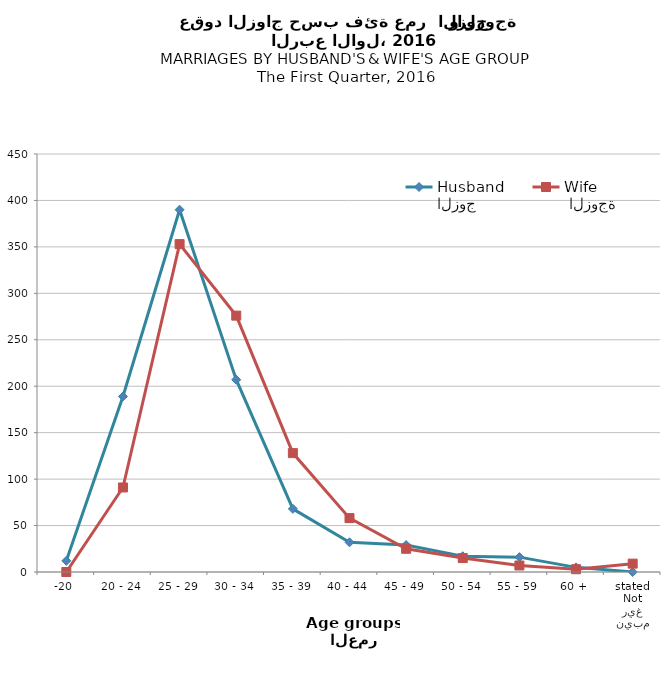
| Category | الزوج
Husband |  الزوجة
Wife |
|---|---|---|
| -20 | 12 | 0 |
| 20 - 24 | 189 | 91 |
| 25 - 29 | 390 | 353 |
| 30 - 34 | 207 | 276 |
| 35 - 39 | 68 | 128 |
| 40 - 44 | 32 | 58 |
| 45 - 49 | 29 | 25 |
| 50 - 54 | 17 | 15 |
| 55 - 59 | 16 | 7 |
| 60 + | 5 | 3 |
| غير مبين
Not stated | 0 | 9 |